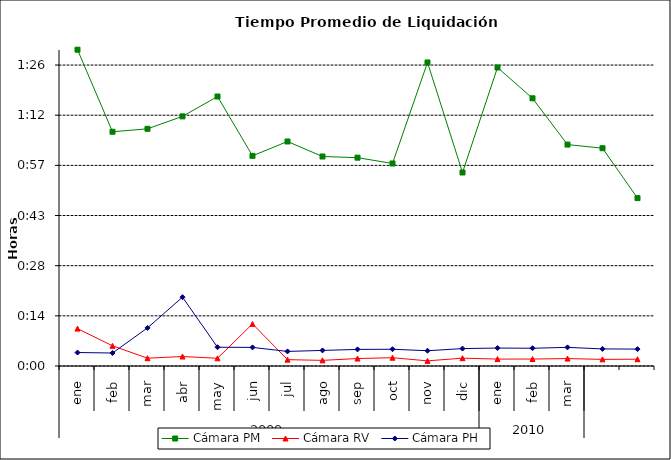
| Category | Cámara PM | Cámara RV | Cámara PH |
|---|---|---|---|
| 0 | 0.063 | 0.007 | 0.003 |
| 1 | 0.047 | 0.004 | 0.003 |
| 2 | 0.047 | 0.002 | 0.008 |
| 3 | 0.05 | 0.002 | 0.014 |
| 4 | 0.054 | 0.002 | 0.004 |
| 5 | 0.042 | 0.008 | 0.004 |
| 6 | 0.045 | 0.001 | 0.003 |
| 7 | 0.042 | 0.001 | 0.003 |
| 8 | 0.042 | 0.001 | 0.003 |
| 9 | 0.04 | 0.002 | 0.003 |
| 10 | 0.061 | 0.001 | 0.003 |
| 11 | 0.039 | 0.002 | 0.003 |
| 12 | 0.06 | 0.001 | 0.004 |
| 13 | 0.053 | 0.001 | 0.004 |
| 14 | 0.044 | 0.001 | 0.004 |
| 15 | 0.043 | 0.001 | 0.003 |
| 16 | 0.033 | 0.001 | 0.003 |